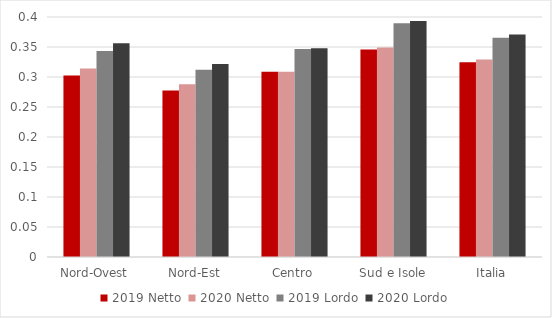
| Category | 2019 | 2020 |
|---|---|---|
| Nord-Ovest | 0.343 | 0.356 |
| Nord-Est | 0.312 | 0.322 |
| Centro | 0.347 | 0.348 |
| Sud e Isole | 0.39 | 0.393 |
| Italia | 0.365 | 0.371 |